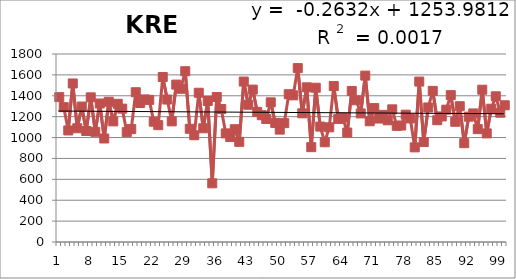
| Category | 1913-2012 |
|---|---|
| 0 | 1387 |
| 1 | 1291 |
| 2 | 1068 |
| 3 | 1518 |
| 4 | 1089 |
| 5 | 1297 |
| 6 | 1063 |
| 7 | 1385 |
| 8 | 1055 |
| 9 | 1326 |
| 10 | 991 |
| 11 | 1343 |
| 12 | 1155 |
| 13 | 1323 |
| 14 | 1277 |
| 15 | 1052 |
| 16 | 1081 |
| 17 | 1434 |
| 18 | 1331 |
| 19 | 1365 |
| 20 | 1361 |
| 21 | 1152 |
| 22 | 1119 |
| 23 | 1580 |
| 24 | 1364 |
| 25 | 1155 |
| 26 | 1507 |
| 27 | 1467 |
| 28 | 1635 |
| 29 | 1084 |
| 30 | 1022 |
| 31 | 1429 |
| 32 | 1089 |
| 33 | 1350 |
| 34 | 562 |
| 35 | 1388 |
| 36 | 1273 |
| 37 | 1040 |
| 38 | 1005 |
| 39 | 1080 |
| 40 | 959 |
| 41 | 1536 |
| 42 | 1314 |
| 43 | 1459 |
| 44 | 1246 |
| 45 | 1214 |
| 46 | 1178 |
| 47 | 1337 |
| 48 | 1140 |
| 49 | 1076 |
| 50 | 1138 |
| 51 | 1415 |
| 52 | 1404 |
| 53 | 1665 |
| 54 | 1232 |
| 55 | 1481 |
| 56 | 908 |
| 57 | 1477 |
| 58 | 1105 |
| 59 | 955 |
| 60 | 1098 |
| 61 | 1493 |
| 62 | 1178 |
| 63 | 1192 |
| 64 | 1048 |
| 65 | 1446 |
| 66 | 1357 |
| 67 | 1231 |
| 68 | 1593 |
| 69 | 1156 |
| 70 | 1282 |
| 71 | 1182 |
| 72 | 1217 |
| 73 | 1165 |
| 74 | 1270 |
| 75 | 1112 |
| 76 | 1115 |
| 77 | 1219 |
| 78 | 1183 |
| 79 | 906 |
| 80 | 1536 |
| 81 | 957 |
| 82 | 1288 |
| 83 | 1447 |
| 84 | 1166 |
| 85 | 1202 |
| 86 | 1267 |
| 87 | 1406 |
| 88 | 1151 |
| 89 | 1300 |
| 90 | 946 |
| 91 | 1200 |
| 92 | 1231 |
| 93 | 1081 |
| 94 | 1458 |
| 95 | 1040 |
| 96 | 1276 |
| 97 | 1395 |
| 98 | 1238 |
| 99 | 1309 |